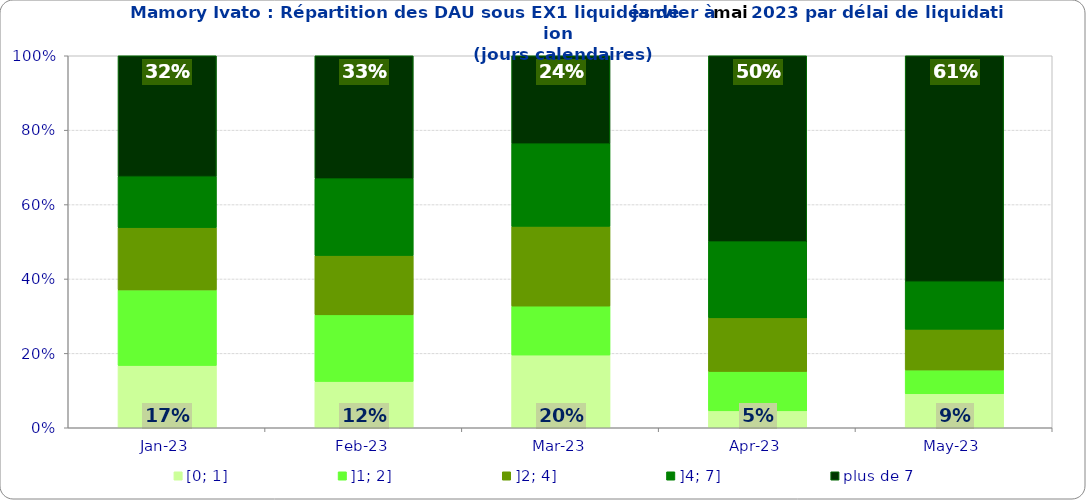
| Category | [0; 1] | ]1; 2] | ]2; 4] | ]4; 7] | plus de 7 |
|---|---|---|---|---|---|
| 2023-01-01 | 0.168 | 0.203 | 0.168 | 0.137 | 0.325 |
| 2023-02-01 | 0.125 | 0.179 | 0.16 | 0.206 | 0.331 |
| 2023-03-01 | 0.195 | 0.132 | 0.214 | 0.222 | 0.237 |
| 2023-04-01 | 0.045 | 0.106 | 0.144 | 0.205 | 0.5 |
| 2023-05-01 | 0.091 | 0.064 | 0.11 | 0.128 | 0.607 |